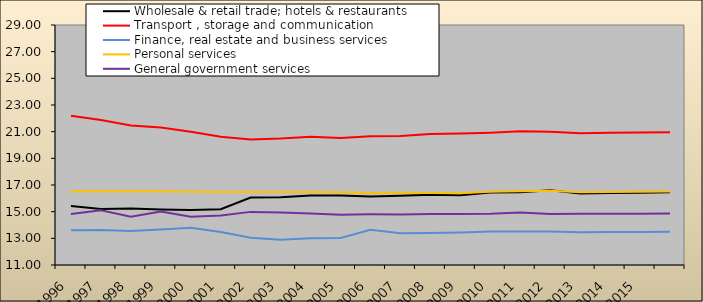
| Category | Wholesale & retail trade; hotels & restaurants | Transport , storage and communication | Finance, real estate and business services | Personal services | General government services |
|---|---|---|---|---|---|
| 1996.0 | 15.423 | 22.188 | 13.604 | 16.535 | 14.83 |
| 1997.0 | 15.207 | 21.868 | 13.626 | 16.534 | 15.099 |
| 1998.0 | 15.231 | 21.471 | 13.554 | 16.528 | 14.619 |
| 1999.0 | 15.168 | 21.315 | 13.664 | 16.528 | 15.011 |
| 2000.0 | 15.127 | 20.991 | 13.798 | 16.494 | 14.613 |
| 2001.0 | 15.183 | 20.622 | 13.476 | 16.477 | 14.707 |
| 2002.0 | 16.064 | 20.421 | 13.051 | 16.481 | 14.984 |
| 2003.0 | 16.087 | 20.488 | 12.901 | 16.472 | 14.94 |
| 2004.0 | 16.213 | 20.612 | 13.006 | 16.466 | 14.857 |
| 2005.0 | 16.219 | 20.531 | 13.026 | 16.465 | 14.774 |
| 2006.0 | 16.131 | 20.653 | 13.635 | 16.391 | 14.802 |
| 2007.0 | 16.198 | 20.669 | 13.388 | 16.419 | 14.79 |
| 2008.0 | 16.274 | 20.821 | 13.396 | 16.403 | 14.831 |
| 2009.0 | 16.228 | 20.866 | 13.429 | 16.373 | 14.823 |
| 2010.0 | 16.445 | 20.928 | 13.507 | 16.492 | 14.837 |
| 2011.0 | 16.457 | 21.036 | 13.507 | 16.531 | 14.936 |
| 2012.0 | 16.603 | 20.986 | 13.512 | 16.574 | 14.825 |
| 2013.0 | 16.368 | 20.884 | 13.457 | 16.465 | 14.841 |
| 2014.0 | 16.396 | 20.92 | 13.468 | 16.473 | 14.849 |
| 2015.0 | 16.416 | 20.937 | 13.48 | 16.485 | 14.852 |